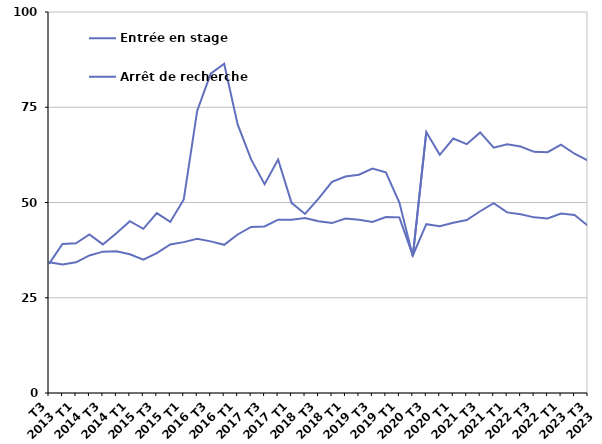
| Category | Entrée en stage | Arrêt de recherche |
|---|---|---|
| T3
2013 | 33.9 | 34.3 |
| T4
2013 | 39.1 | 33.7 |
| T1
2014 | 39.3 | 34.3 |
| T2
2014 | 41.6 | 36.1 |
| T3
2014 | 39 | 37.1 |
| T4
2014 | 41.9 | 37.2 |
| T1
2015 | 45.1 | 36.4 |
| T2
2015 | 43.1 | 35 |
| T3
2015 | 47.2 | 36.7 |
| T4
2015 | 44.9 | 39 |
| T1
2016 | 50.8 | 39.6 |
| T2
2016 | 74.1 | 40.5 |
| T3
2016 | 83.8 | 39.8 |
| T4
2016 | 86.4 | 38.9 |
| T1
2017 | 70.5 | 41.6 |
| T2
2017 | 61.3 | 43.6 |
| T3
2017 | 54.8 | 43.7 |
| T4
2017 | 61.3 | 45.5 |
| T1
2018 | 49.9 | 45.5 |
| T2
2018 | 47 | 45.9 |
| T3
2018 | 51 | 45.1 |
| T4
2018 | 55.4 | 44.6 |
| T1
2019 | 56.8 | 45.8 |
| T2
2019 | 57.3 | 45.5 |
| T3
2019 | 58.9 | 44.9 |
| T4
2019 | 57.9 | 46.2 |
| T1
2020 | 50 | 46.1 |
| T2
2020 | 35.9 | 36.1 |
| T3
2020 | 68.5 | 44.3 |
| T4
2020 | 62.5 | 43.8 |
| T1
2021 | 66.8 | 44.7 |
| T2
2021 | 65.3 | 45.4 |
| T3
2021 | 68.4 | 47.7 |
| T4
2021 | 64.4 | 49.8 |
| T1
2022 | 65.3 | 47.4 |
| T2
2022 | 64.7 | 46.9 |
| T3
2022 | 63.3 | 46.1 |
| T4
2022 | 63.2 | 45.8 |
| T1
2023 | 65.2 | 47.1 |
| T2
2023 | 62.8 | 46.7 |
| T3
2023 | 61 | 43.9 |